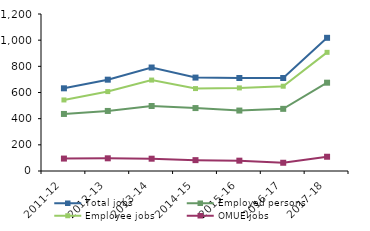
| Category | Total jobs | Employed persons | Employee jobs | OMUE jobs |
|---|---|---|---|---|
| 2011-12 | 632 | 436 | 543 | 95 |
| 2012-13 | 698 | 459 | 607 | 97 |
| 2013-14 | 791 | 497 | 695 | 94 |
| 2014-15 | 714 | 481 | 630 | 83 |
| 2015-16 | 711 | 462 | 635 | 79 |
| 2016-17 | 711 | 475 | 648 | 63 |
| 2017-18 | 1018 | 675 | 907 | 109 |